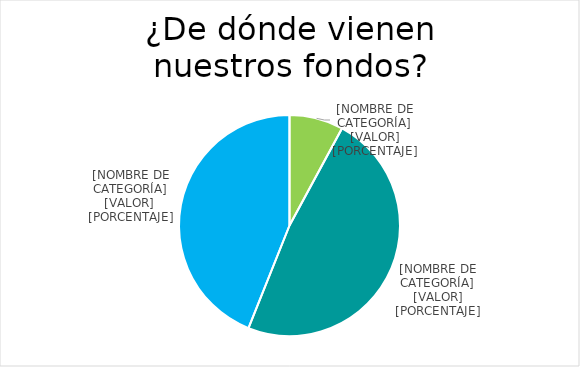
| Category | Series 0 |
|---|---|
| Donaciones/ subvenciones | 591 |
| Personas socias | 3610 |
| Campañas | 3293.22 |